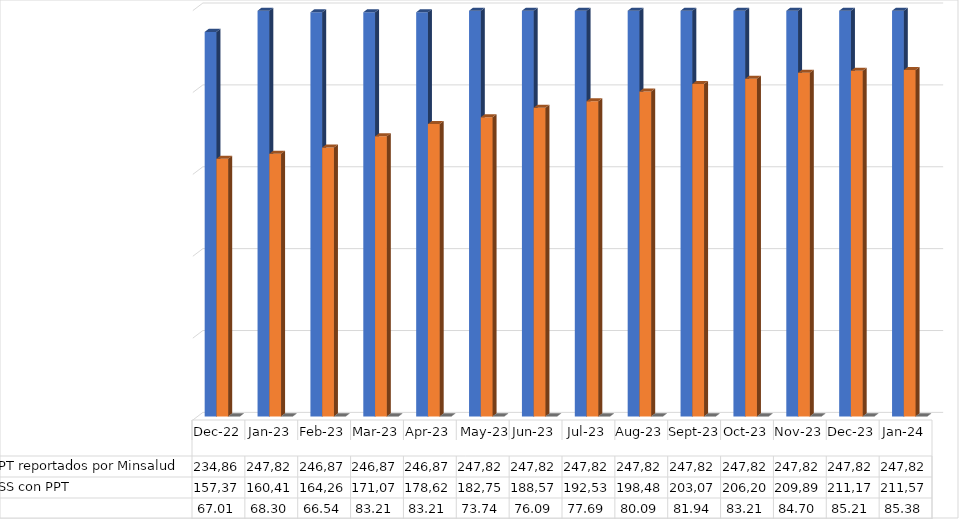
| Category | Nro de Migrantes con PPT reportados por Minsalud  | Nro de Afiliados al SGSSS con PPT | % Cobertura |
|---|---|---|---|
| 2022-12-01 | 234864 | 157372 | 67.006 |
| 2023-01-01 | 247821 | 160416 | 68.302 |
| 2023-02-01 | 246878 | 164261 | 66.535 |
| 2023-03-01 | 246878 | 171077 | 83.206 |
| 2023-04-01 | 246878 | 178625 | 83.206 |
| 2023-05-01 | 247821 | 182754 | 73.744 |
| 2023-06-01 | 247821 | 188578 | 76.094 |
| 2023-07-01 | 247821 | 192533 | 77.69 |
| 2023-08-01 | 247821 | 198485 | 80.092 |
| 2023-09-01 | 247821 | 203073 | 81.943 |
| 2023-10-01 | 247821 | 206201 | 83.206 |
| 2023-11-01 | 247821 | 209898 | 84.697 |
| 2023-12-01 | 247821 | 211175 | 85.213 |
| 2024-01-01 | 247821 | 211578 | 85.375 |